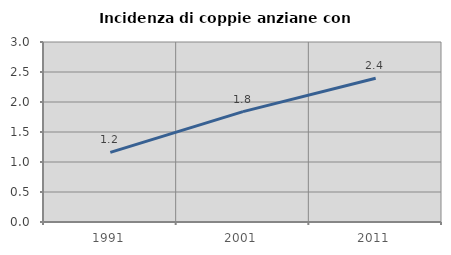
| Category | Incidenza di coppie anziane con figli |
|---|---|
| 1991.0 | 1.161 |
| 2001.0 | 1.839 |
| 2011.0 | 2.395 |